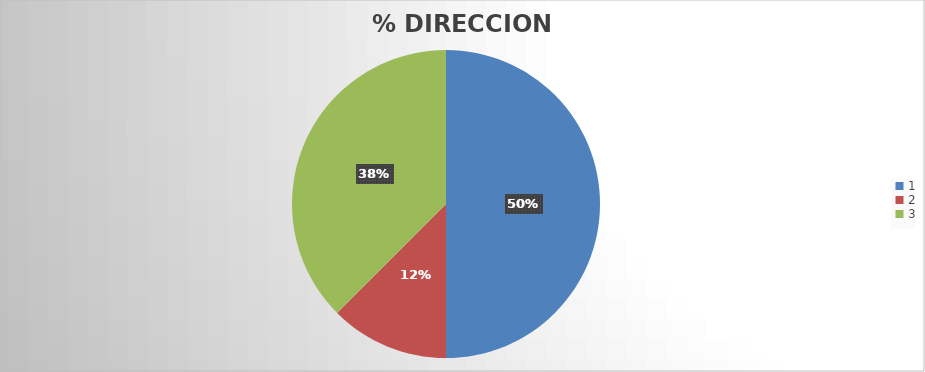
| Category | Series 0 |
|---|---|
| 0 | 4 |
| 1 | 1 |
| 2 | 3 |